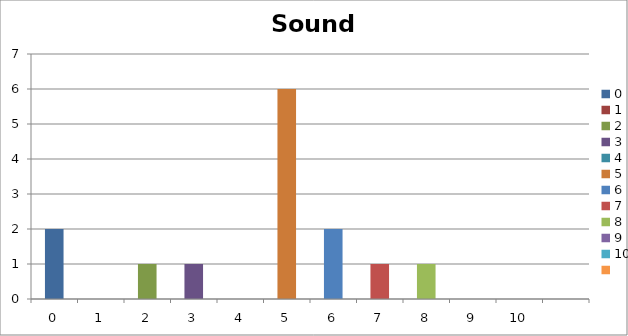
| Category | Sound Around |
|---|---|
| 0.0 | 2 |
| 1.0 | 0 |
| 2.0 | 1 |
| 3.0 | 1 |
| 4.0 | 0 |
| 5.0 | 6 |
| 6.0 | 2 |
| 7.0 | 1 |
| 8.0 | 1 |
| 9.0 | 0 |
| 10.0 | 0 |